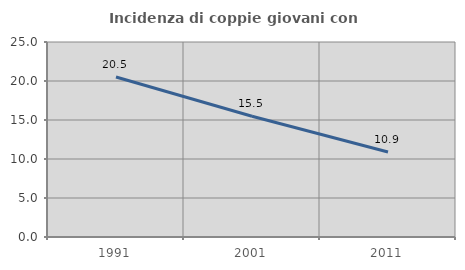
| Category | Incidenza di coppie giovani con figli |
|---|---|
| 1991.0 | 20.507 |
| 2001.0 | 15.482 |
| 2011.0 | 10.891 |